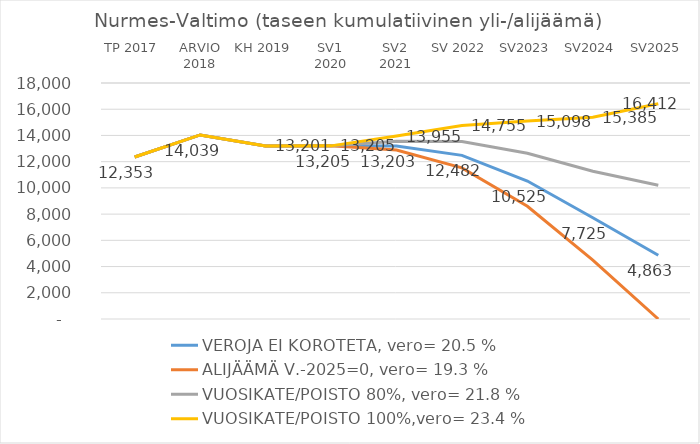
| Category | VEROJA EI KOROTETA, vero= | ALIJÄÄMÄ V.-2025=0, vero= | VUOSIKATE/POISTO 80%, vero= | VUOSIKATE/POISTO 100%,vero= |
|---|---|---|---|---|
| TP 2017 | 12353 | 12353 | 12353 | 12353 |
| ARVIO 2018 | 14039.303 | 14039.303 | 14039.303 | 14039.303 |
| KH 2019 | 13200.629 | 13200.629 | 13200.629 | 13200.629 |
| SV1 2020 | 13204.793 | 13204.793 | 13204.793 | 13204.793 |
| SV2 2021 | 13203.26 | 12886.742 | 13551.05 | 13954.905 |
| SV 2022 | 12481.528 | 11524.205 | 13533.435 | 14754.91 |
| SV2023 | 10525.395 | 8599.931 | 12641.094 | 15097.846 |
| SV2024 | 7724.587 | 4498.963 | 11268.902 | 15384.565 |
| SV2025 | 4863.241 | 0 | 10206.968 | 16412.111 |